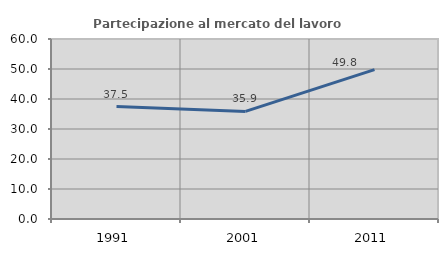
| Category | Partecipazione al mercato del lavoro  femminile |
|---|---|
| 1991.0 | 37.467 |
| 2001.0 | 35.873 |
| 2011.0 | 49.807 |